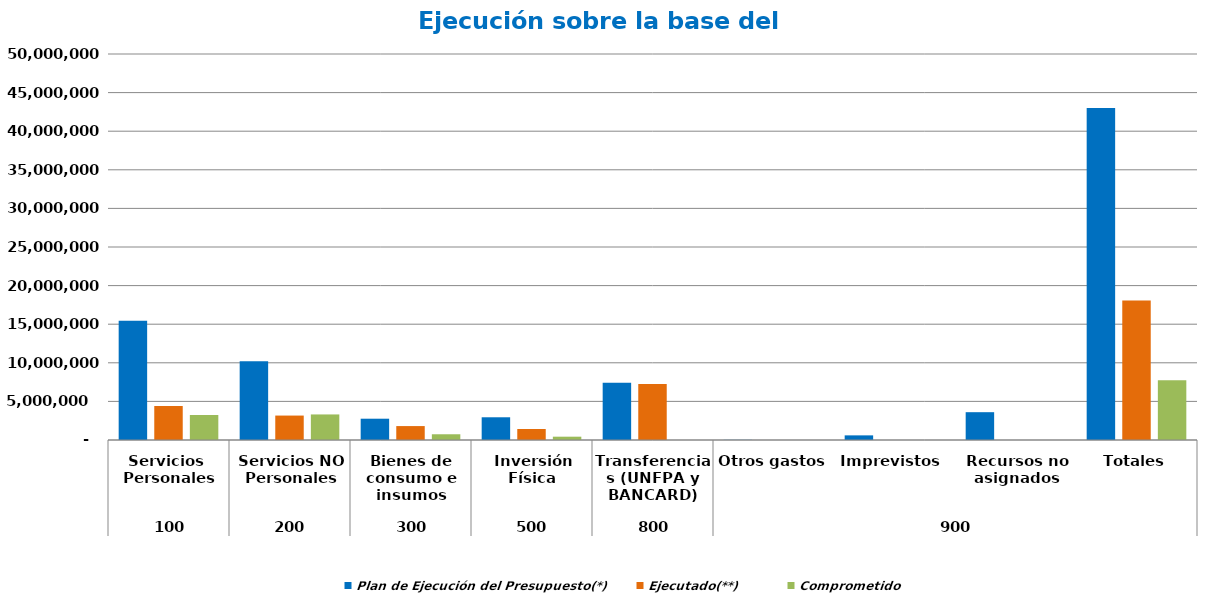
| Category | Plan de Ejecución del Presupuesto(*) | Ejecutado(**) | Comprometido |
|---|---|---|---|
| 0 | 15433776 | 4406982.317 | 3239579.423 |
| 1 | 10213271 | 3164923.747 | 3311260.667 |
| 2 | 2758597 | 1804025.631 | 743468.438 |
| 3 | 2943700 | 1422779.064 | 429625.996 |
| 4 | 7427466 | 7262479.712 | 0 |
| 5 | 20516 | 0 | 0 |
| 6 | 600000 | 0 | 0 |
| 7 | 3602674 | 0 | 0 |
| 8 | 43000000 | 18061190.471 | 7723934.524 |